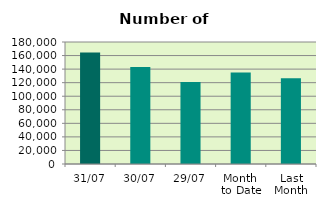
| Category | Series 0 |
|---|---|
| 31/07 | 164690 |
| 30/07 | 143122 |
| 29/07 | 121122 |
| Month 
to Date | 134976 |
| Last
Month | 126531 |